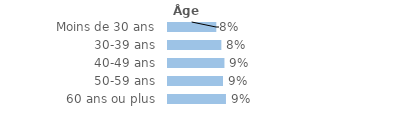
| Category | Series 0 |
|---|---|
| Moins de 30 ans | 0.077 |
| 30-39 ans | 0.085 |
| 40-49 ans | 0.09 |
| 50-59 ans | 0.087 |
| 60 ans ou plus | 0.092 |